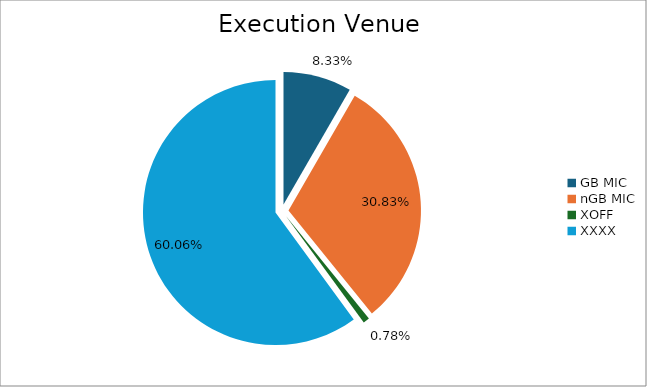
| Category | Series 0 |
|---|---|
| GB MIC | 774667.509 |
| nGB MIC | 2867077.777 |
| XOFF | 72280.007 |
| XXXX | 5584592.994 |